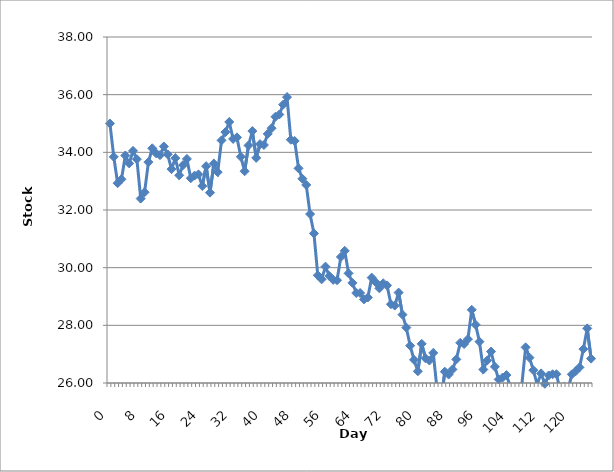
| Category | Series 0 |
|---|---|
| 0.0 | 35 |
| 1.0 | 33.843 |
| 2.0 | 32.93 |
| 3.0 | 33.066 |
| 4.0 | 33.889 |
| 5.0 | 33.616 |
| 6.0 | 34.052 |
| 7.0 | 33.764 |
| 8.0 | 32.396 |
| 9.0 | 32.615 |
| 10.0 | 33.659 |
| 11.0 | 34.141 |
| 12.0 | 33.966 |
| 13.0 | 33.904 |
| 14.0 | 34.204 |
| 15.0 | 33.928 |
| 16.0 | 33.417 |
| 17.0 | 33.799 |
| 18.0 | 33.205 |
| 19.0 | 33.556 |
| 20.0 | 33.772 |
| 21.0 | 33.101 |
| 22.0 | 33.192 |
| 23.0 | 33.234 |
| 24.0 | 32.833 |
| 25.0 | 33.52 |
| 26.0 | 32.601 |
| 27.0 | 33.609 |
| 28.0 | 33.314 |
| 29.0 | 34.415 |
| 30.0 | 34.702 |
| 31.0 | 35.052 |
| 32.0 | 34.464 |
| 33.0 | 34.519 |
| 34.0 | 33.846 |
| 35.0 | 33.344 |
| 36.0 | 34.238 |
| 37.0 | 34.738 |
| 38.0 | 33.808 |
| 39.0 | 34.284 |
| 40.0 | 34.254 |
| 41.0 | 34.64 |
| 42.0 | 34.836 |
| 43.0 | 35.234 |
| 44.0 | 35.311 |
| 45.0 | 35.654 |
| 46.0 | 35.914 |
| 47.0 | 34.438 |
| 48.0 | 34.394 |
| 49.0 | 33.444 |
| 50.0 | 33.085 |
| 51.0 | 32.868 |
| 52.0 | 31.859 |
| 53.0 | 31.189 |
| 54.0 | 29.735 |
| 55.0 | 29.595 |
| 56.0 | 30.035 |
| 57.0 | 29.71 |
| 58.0 | 29.577 |
| 59.0 | 29.563 |
| 60.0 | 30.373 |
| 61.0 | 30.584 |
| 62.0 | 29.803 |
| 63.0 | 29.473 |
| 64.0 | 29.122 |
| 65.0 | 29.122 |
| 66.0 | 28.9 |
| 67.0 | 28.967 |
| 68.0 | 29.654 |
| 69.0 | 29.498 |
| 70.0 | 29.282 |
| 71.0 | 29.459 |
| 72.0 | 29.385 |
| 73.0 | 28.731 |
| 74.0 | 28.685 |
| 75.0 | 29.135 |
| 76.0 | 28.369 |
| 77.0 | 27.922 |
| 78.0 | 27.293 |
| 79.0 | 26.805 |
| 80.0 | 26.408 |
| 81.0 | 27.359 |
| 82.0 | 26.855 |
| 83.0 | 26.779 |
| 84.0 | 27.042 |
| 85.0 | 25.754 |
| 86.0 | 25.362 |
| 87.0 | 26.393 |
| 88.0 | 26.294 |
| 89.0 | 26.469 |
| 90.0 | 26.819 |
| 91.0 | 27.393 |
| 92.0 | 27.353 |
| 93.0 | 27.521 |
| 94.0 | 28.54 |
| 95.0 | 28.021 |
| 96.0 | 27.433 |
| 97.0 | 26.468 |
| 98.0 | 26.778 |
| 99.0 | 27.09 |
| 100.0 | 26.563 |
| 101.0 | 26.123 |
| 102.0 | 26.188 |
| 103.0 | 26.274 |
| 104.0 | 25.887 |
| 105.0 | 25.626 |
| 106.0 | 25.624 |
| 107.0 | 25.924 |
| 108.0 | 27.236 |
| 109.0 | 26.879 |
| 110.0 | 26.445 |
| 111.0 | 25.95 |
| 112.0 | 26.334 |
| 113.0 | 25.973 |
| 114.0 | 26.261 |
| 115.0 | 26.305 |
| 116.0 | 26.305 |
| 117.0 | 25.728 |
| 118.0 | 25.951 |
| 119.0 | 25.757 |
| 120.0 | 26.298 |
| 121.0 | 26.409 |
| 122.0 | 26.543 |
| 123.0 | 27.176 |
| 124.0 | 27.893 |
| 125.0 | 26.845 |